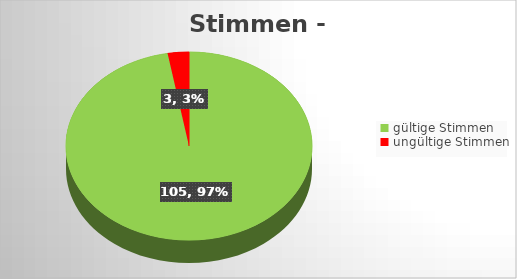
| Category | Series 0 |
|---|---|
| gültige Stimmen | 105 |
| ungültige Stimmen | 3 |